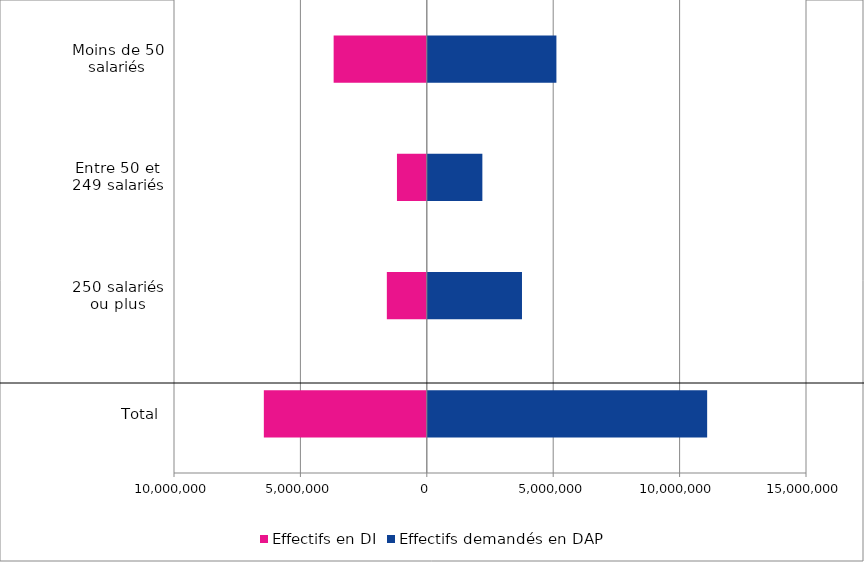
| Category | Effectifs en DI | Effectifs demandés en DAP |
|---|---|---|
| Total | -6446144 | 11089999 |
| 250 salariés ou plus | -1580702 | 3765206 |
| Entre 50 et 249 salariés | -1180395 | 2197892 |
| Moins de 50 salariés | -3685047 | 5126901 |